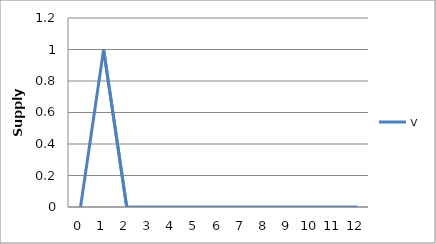
| Category | v |
|---|---|
| 0.0 | 0 |
| 1.0 | 1 |
| 2.0 | 0 |
| 3.0 | 0 |
| 4.0 | 0 |
| 5.0 | 0 |
| 6.0 | 0 |
| 7.0 | 0 |
| 8.0 | 0 |
| 9.0 | 0 |
| 10.0 | 0 |
| 11.0 | 0 |
| 12.0 | 0 |